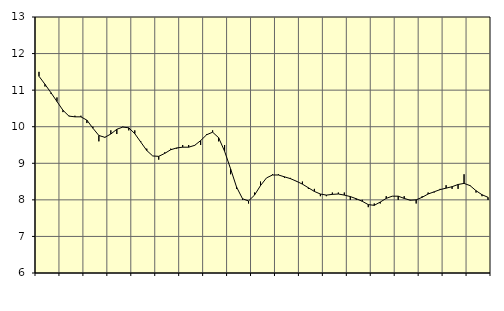
| Category | Piggar | Tillverkning av verkstadsvaror, SNI 25-30, 33 |
|---|---|---|
| nan | 11.5 | 11.38 |
| 1.0 | 11.1 | 11.16 |
| 1.0 | 10.9 | 10.93 |
| 1.0 | 10.8 | 10.69 |
| nan | 10.4 | 10.45 |
| 2.0 | 10.3 | 10.29 |
| 2.0 | 10.3 | 10.27 |
| 2.0 | 10.3 | 10.27 |
| nan | 10.1 | 10.18 |
| 3.0 | 10 | 9.96 |
| 3.0 | 9.6 | 9.76 |
| 3.0 | 9.7 | 9.71 |
| nan | 9.9 | 9.8 |
| 4.0 | 9.8 | 9.93 |
| 4.0 | 10 | 9.99 |
| 4.0 | 9.9 | 9.97 |
| nan | 9.9 | 9.81 |
| 5.0 | 9.6 | 9.58 |
| 5.0 | 9.4 | 9.35 |
| 5.0 | 9.2 | 9.2 |
| nan | 9.1 | 9.19 |
| 6.0 | 9.3 | 9.27 |
| 6.0 | 9.4 | 9.37 |
| 6.0 | 9.4 | 9.42 |
| nan | 9.5 | 9.44 |
| 7.0 | 9.5 | 9.44 |
| 7.0 | 9.5 | 9.49 |
| 7.0 | 9.5 | 9.62 |
| nan | 9.8 | 9.78 |
| 8.0 | 9.9 | 9.85 |
| 8.0 | 9.6 | 9.7 |
| 8.0 | 9.5 | 9.33 |
| nan | 8.7 | 8.85 |
| 9.0 | 8.3 | 8.35 |
| 9.0 | 8 | 8.03 |
| 9.0 | 7.9 | 7.97 |
| nan | 8.2 | 8.13 |
| 10.0 | 8.5 | 8.39 |
| 10.0 | 8.6 | 8.6 |
| 10.0 | 8.7 | 8.68 |
| nan | 8.7 | 8.68 |
| 11.0 | 8.6 | 8.63 |
| 11.0 | 8.6 | 8.58 |
| 11.0 | 8.5 | 8.51 |
| nan | 8.5 | 8.43 |
| 12.0 | 8.3 | 8.33 |
| 12.0 | 8.3 | 8.23 |
| 12.0 | 8.1 | 8.16 |
| nan | 8.1 | 8.13 |
| 13.0 | 8.2 | 8.15 |
| 13.0 | 8.2 | 8.16 |
| 13.0 | 8.2 | 8.13 |
| nan | 8 | 8.09 |
| 14.0 | 8 | 8.03 |
| 14.0 | 8 | 7.96 |
| 14.0 | 7.8 | 7.87 |
| nan | 7.9 | 7.85 |
| 15.0 | 7.9 | 7.94 |
| 15.0 | 8.1 | 8.04 |
| 15.0 | 8.1 | 8.1 |
| nan | 8 | 8.1 |
| 16.0 | 8.1 | 8.04 |
| 16.0 | 8 | 7.99 |
| 16.0 | 7.9 | 8 |
| nan | 8.1 | 8.07 |
| 17.0 | 8.2 | 8.16 |
| 17.0 | 8.2 | 8.22 |
| 17.0 | 8.3 | 8.28 |
| nan | 8.4 | 8.32 |
| 18.0 | 8.3 | 8.36 |
| 18.0 | 8.3 | 8.42 |
| 18.0 | 8.7 | 8.45 |
| nan | 8.4 | 8.39 |
| 19.0 | 8.2 | 8.25 |
| 19.0 | 8.1 | 8.14 |
| 19.0 | 8 | 8.07 |